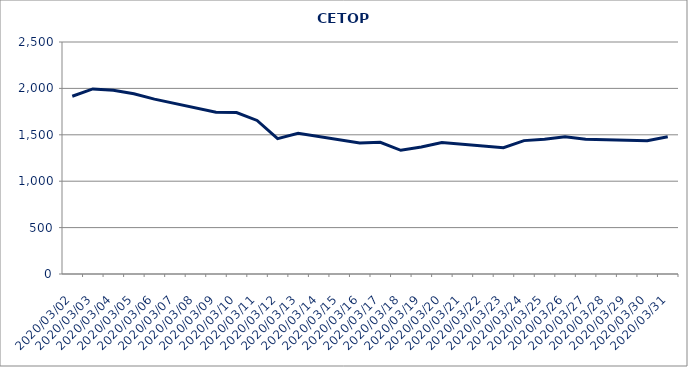
| Category | Series 3 |
|---|---|
| 2020-03-02 | 1915.812 |
| 2020-03-03 | 1994.418 |
| 2020-03-04 | 1980.79 |
| 2020-03-05 | 1942.986 |
| 2020-03-06 | 1884.333 |
| 2020-03-09 | 1742.838 |
| 2020-03-10 | 1739.523 |
| 2020-03-11 | 1654.414 |
| 2020-03-12 | 1458.928 |
| 2020-03-13 | 1515.225 |
| 2020-03-16 | 1411.769 |
| 2020-03-17 | 1419.91 |
| 2020-03-18 | 1332.932 |
| 2020-03-19 | 1368.187 |
| 2020-03-20 | 1416.41 |
| 2020-03-23 | 1360.369 |
| 2020-03-24 | 1437.401 |
| 2020-03-25 | 1453.309 |
| 2020-03-26 | 1479.751 |
| 2020-03-27 | 1451.143 |
| 2020-03-30 | 1436.146 |
| 2020-03-31 | 1478.335 |